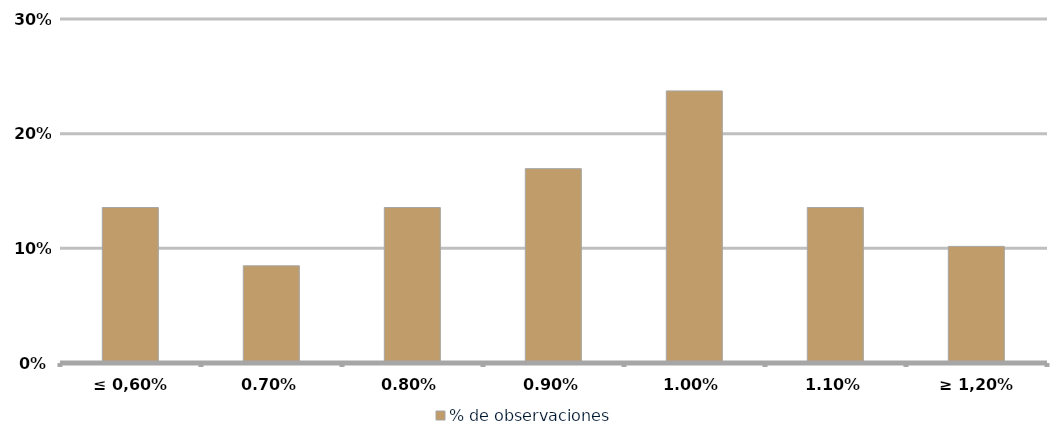
| Category | % de observaciones  |
|---|---|
| ≤ 0,60% | 0.136 |
| 0,70% | 0.085 |
| 0,80% | 0.136 |
| 0,90% | 0.169 |
| 1,00% | 0.237 |
| 1,10% | 0.136 |
| ≥ 1,20% | 0.102 |